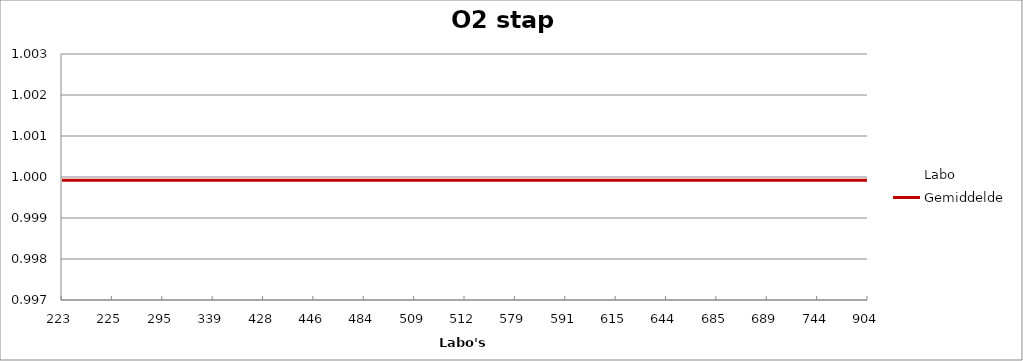
| Category | Labo | Gemiddelde |
|---|---|---|
| 223.0 | 1.001 | 1 |
| 225.0 | 1 | 1 |
| 295.0 | 1 | 1 |
| 339.0 | 1.001 | 1 |
| 428.0 | 0.999 | 1 |
| 446.0 | 0.999 | 1 |
| 484.0 | 1.001 | 1 |
| 509.0 | 1 | 1 |
| 512.0 | 1 | 1 |
| 579.0 | 1 | 1 |
| 591.0 | 1 | 1 |
| 615.0 | 0.999 | 1 |
| 644.0 | 1 | 1 |
| 685.0 | 0.999 | 1 |
| 689.0 | 1 | 1 |
| 744.0 | 1 | 1 |
| 904.0 | 0.999 | 1 |